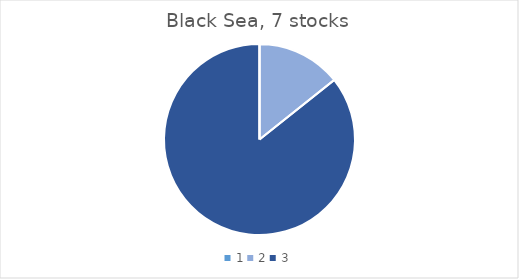
| Category | Black Sea |
|---|---|
| 0 | 0 |
| 1 | 1 |
| 2 | 6 |